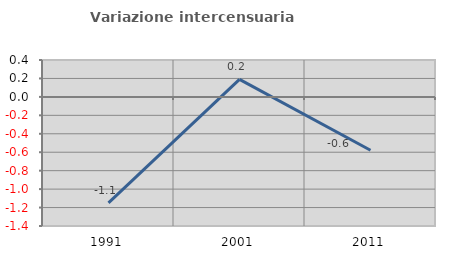
| Category | Variazione intercensuaria annua |
|---|---|
| 1991.0 | -1.15 |
| 2001.0 | 0.19 |
| 2011.0 | -0.579 |